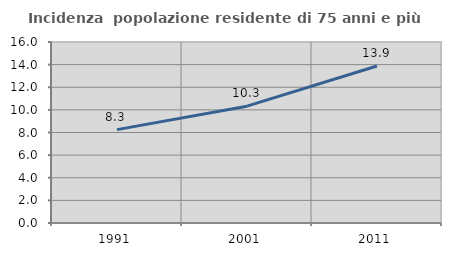
| Category | Incidenza  popolazione residente di 75 anni e più |
|---|---|
| 1991.0 | 8.253 |
| 2001.0 | 10.326 |
| 2011.0 | 13.876 |